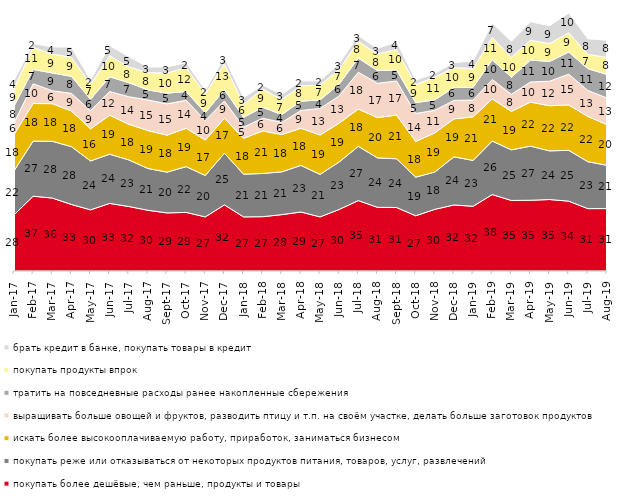
| Category | покупать более дешёвые, чем раньше, продукты и товары | покупать реже или отказываться от некоторых продуктов питания, товаров, услуг, развлечений | искать более высокооплачиваемую работу, приработок, заниматься бизнесом | выращивать больше овощей и фруктов, разводить птицу и т.п. на своём участке, делать больше заготовок продуктов  | тратить на повседневные расходы ранее накопленные сбережения | покупать продукты впрок | брать кредит в банке, покупать товары в кредит |
|---|---|---|---|---|---|---|---|
| 2017-01-01 | 27.5 | 21.65 | 17.8 | 5.7 | 8.15 | 8.85 | 3.75 |
| 2017-02-01 | 36.7 | 27 | 18.45 | 9.7 | 7.05 | 10.8 | 1.85 |
| 2017-03-01 | 35.8 | 27.85 | 18.45 | 6.35 | 8.7 | 9.25 | 3.5 |
| 2017-04-01 | 32.65 | 28.35 | 17.55 | 8.6 | 8.35 | 9.4 | 4.95 |
| 2017-05-01 | 30 | 24 | 15.75 | 8.9 | 5.6 | 7.3 | 2.2 |
| 2017-06-01 | 33.15 | 24.15 | 19.1 | 11.65 | 7.2 | 10.35 | 5 |
| 2017-07-01 | 31.65 | 22.85 | 17.5 | 13.5 | 6.9 | 7.75 | 4.95 |
| 2017-08-01 | 29.8 | 20.5 | 18.6 | 15 | 4.95 | 8.45 | 2.75 |
| 2017-09-01 | 28.5 | 20 | 18.15 | 15.35 | 5.25 | 9.85 | 3 |
| 2017-10-01 | 28.75 | 22.45 | 18.8 | 13.75 | 4.3 | 11.7 | 2.45 |
| 2017-11-01 | 26.55 | 20.3 | 17.4 | 9.6 | 3.8 | 9.3 | 1.7 |
| 2017-12-01 | 32.45 | 25.35 | 17.1 | 8.55 | 5.55 | 12.7 | 3.05 |
| 2018-01-01 | 26.55 | 20.95 | 17.6 | 5.45 | 4.85 | 6.35 | 3.3 |
| 2018-02-01 | 26.65 | 21.2 | 20.85 | 6.25 | 5.35 | 9 | 1.85 |
| 2018-03-01 | 27.65 | 21 | 18.3 | 5.95 | 3.85 | 7.35 | 2.65 |
| 2018-04-01 | 28.95 | 22.85 | 18.25 | 8.7 | 4.55 | 7.55 | 2.35 |
| 2018-05-01 | 26.55 | 20.85 | 19.3 | 13.05 | 4.2 | 7.25 | 2.15 |
| 2018-06-01 | 30.2 | 23.3 | 19.05 | 13.35 | 5.8 | 7.2 | 2.8 |
| 2018-07-01 | 34.55 | 26.6 | 18.3 | 18.05 | 6.95 | 8.25 | 2.75 |
| 2018-08-01 | 31.25 | 24.25 | 19.75 | 16.85 | 6.2 | 8.15 | 2.7 |
| 2018-09-01 | 31.15 | 23.9 | 21.45 | 16.7 | 5.45 | 10.1 | 3.7 |
| 2018-10-01 | 27.1 | 18.95 | 17.5 | 13.75 | 5.3 | 8.8 | 2.2 |
| 2018-11-01 | 30.24 | 18.313 | 19.212 | 11.078 | 5.14 | 11.178 | 1.796 |
| 2018-12-01 | 32.4 | 23.6 | 18.65 | 9.05 | 6.35 | 9.7 | 2.5 |
| 2019-01-01 | 31.75 | 22.5 | 21.35 | 8.25 | 6.25 | 9.25 | 3.65 |
| 2019-02-01 | 37.5 | 26.25 | 20.7 | 9.5 | 9.7 | 10.95 | 7.05 |
| 2019-03-01 | 34.61 | 24.814 | 18.896 | 8.354 | 8.404 | 9.697 | 7.857 |
| 2019-04-01 | 34.703 | 26.535 | 21.634 | 9.851 | 10.743 | 9.752 | 9.01 |
| 2019-05-01 | 35.067 | 23.873 | 22.14 | 12.036 | 9.658 | 8.816 | 8.717 |
| 2019-06-01 | 34.264 | 24.938 | 22.244 | 15.112 | 10.873 | 9.476 | 9.676 |
| 2019-07-01 | 30.594 | 23.02 | 22.228 | 12.723 | 10.693 | 7.03 | 7.624 |
| 2019-08-01 | 30.619 | 21.229 | 19.93 | 13.087 | 11.538 | 8.392 | 8.392 |